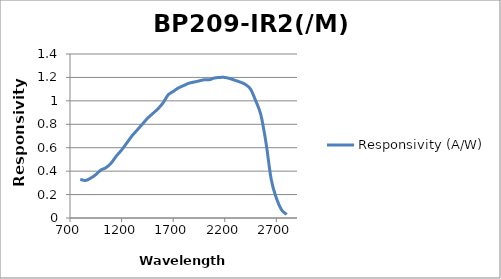
| Category | Responsivity (A/W) |
|---|---|
| 800.0 | 0.33 |
| 850.0 | 0.32 |
| 900.0 | 0.34 |
| 950.0 | 0.37 |
| 1000.0 | 0.41 |
| 1050.0 | 0.43 |
| 1100.0 | 0.47 |
| 1150.0 | 0.53 |
| 1200.0 | 0.58 |
| 1250.0 | 0.64 |
| 1300.0 | 0.7 |
| 1350.0 | 0.75 |
| 1400.0 | 0.8 |
| 1450.0 | 0.85 |
| 1500.0 | 0.89 |
| 1550.0 | 0.93 |
| 1600.0 | 0.98 |
| 1650.0 | 1.05 |
| 1700.0 | 1.08 |
| 1750.0 | 1.11 |
| 1800.0 | 1.13 |
| 1850.0 | 1.15 |
| 1900.0 | 1.16 |
| 1950.0 | 1.17 |
| 2000.0 | 1.18 |
| 2050.0 | 1.18 |
| 2100.0 | 1.195 |
| 2150.0 | 1.2 |
| 2200.0 | 1.2 |
| 2250.0 | 1.19 |
| 2300.0 | 1.175 |
| 2350.0 | 1.16 |
| 2400.0 | 1.14 |
| 2450.0 | 1.1 |
| 2500.0 | 1 |
| 2550.0 | 0.88 |
| 2600.0 | 0.64 |
| 2650.0 | 0.33 |
| 2700.0 | 0.17 |
| 2750.0 | 0.07 |
| 2800.0 | 0.03 |